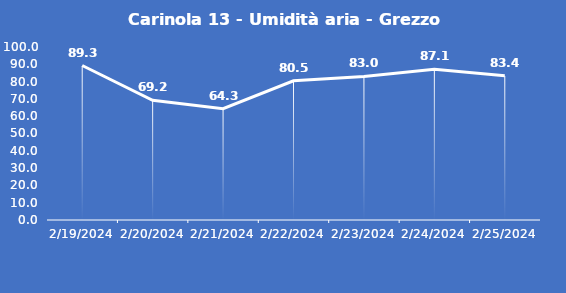
| Category | Carinola 13 - Umidità aria - Grezzo (%) |
|---|---|
| 2/19/24 | 89.3 |
| 2/20/24 | 69.2 |
| 2/21/24 | 64.3 |
| 2/22/24 | 80.5 |
| 2/23/24 | 83 |
| 2/24/24 | 87.1 |
| 2/25/24 | 83.4 |